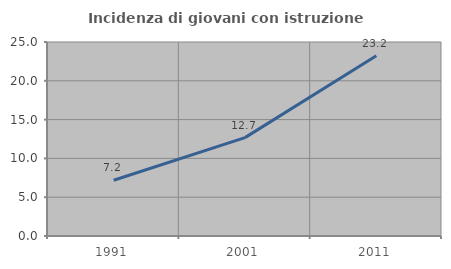
| Category | Incidenza di giovani con istruzione universitaria |
|---|---|
| 1991.0 | 7.185 |
| 2001.0 | 12.678 |
| 2011.0 | 23.232 |